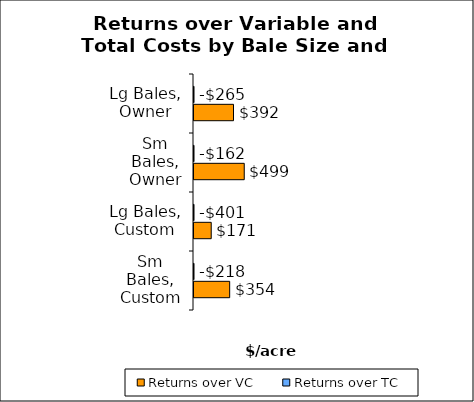
| Category | Returns over VC | Returns over TC |
|---|---|---|
| Sm Bales, Custom | 354.446 | -217.639 |
| Lg Bales, Custom | 171.186 | -400.899 |
| Sm Bales, Owner | 499.154 | -162.331 |
| Lg Bales, Owner | 392.461 | -265.023 |